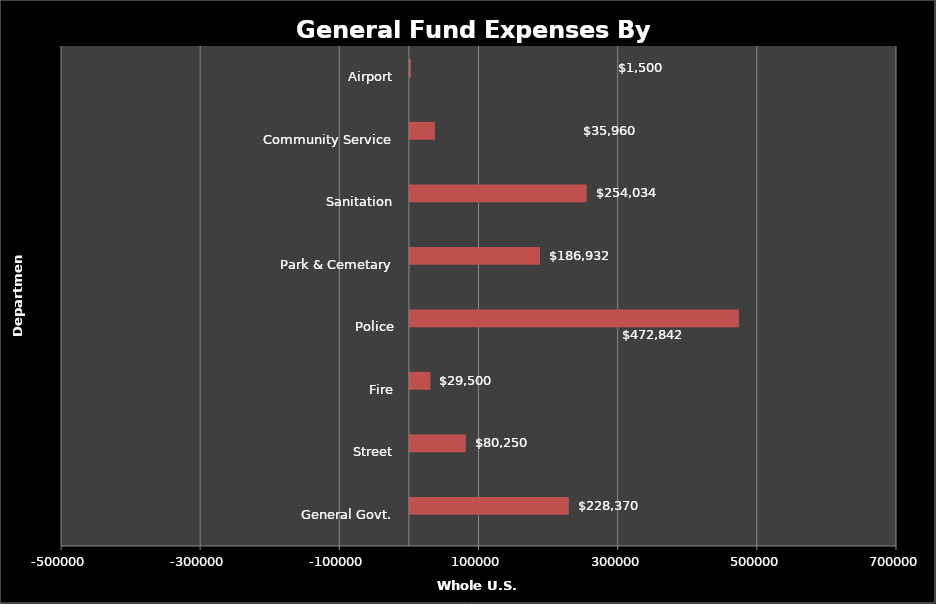
| Category | Series 0 | Series 1 |
|---|---|---|
| General Govt. |  | 228370 |
| Street |  | 80250 |
| Fire |  | 29500 |
| Police |  | 472842 |
| Park & Cemetary |  | 186932 |
| Sanitation |  | 254034 |
| Community Service |  | 35960 |
| Airport |  | 1500 |